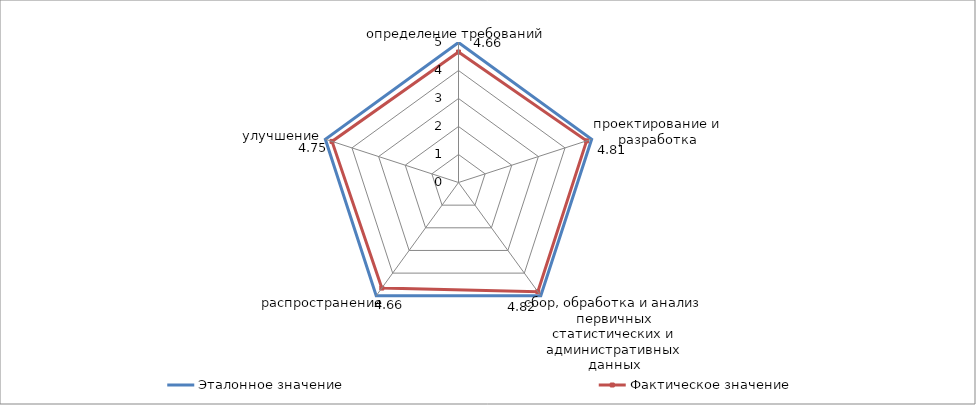
| Category | Эталонное значение | Фактическое значение |
|---|---|---|
| определение требований | 5 | 4.66 |
| проектирование и разработка | 5 | 4.81 |
| сбор, обработка и анализ первичных статистических и административных данных | 5 | 4.82 |
| распространение | 5 | 4.66 |
| улучшение | 5 | 4.75 |